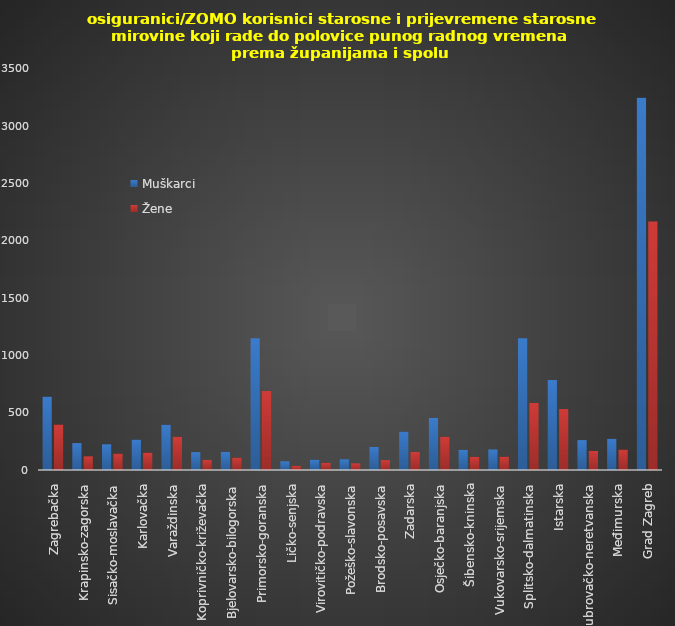
| Category | Muškarci | Žene |
|---|---|---|
| Zagrebačka | 640 | 397 |
| Krapinsko-zagorska | 235 | 119 |
| Sisačko-moslavačka | 224 | 143 |
| Karlovačka | 265 | 151 |
| Varaždinska | 395 | 290 |
| Koprivničko-križevačka | 156 | 88 |
| Bjelovarsko-bilogorska | 159 | 108 |
| Primorsko-goranska | 1150 | 689 |
| Ličko-senjska | 76 | 36 |
| Virovitičko-podravska | 90 | 63 |
| Požeško-slavonska | 93 | 58 |
| Brodsko-posavska | 201 | 86 |
| Zadarska | 335 | 158 |
| Osječko-baranjska | 455 | 290 |
| Šibensko-kninska | 176 | 114 |
| Vukovarsko-srijemska | 179 | 116 |
| Splitsko-dalmatinska | 1151 | 585 |
| Istarska | 785 | 532 |
| Dubrovačko-neretvanska | 261 | 166 |
| Međimurska | 272 | 178 |
| Grad Zagreb | 3248 | 2169 |